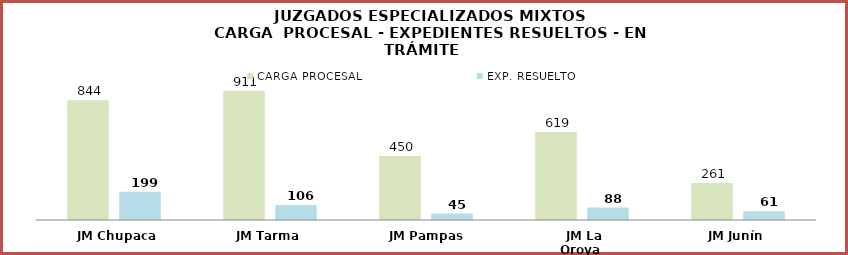
| Category | CARGA PROCESAL | EXP. RESUELTO |
|---|---|---|
| JM Chupaca | 844 | 199 |
| JM Tarma | 911 | 106 |
| JM Pampas | 450 | 45 |
| JM La Oroya | 619 | 88 |
| JM Junín | 261 | 61 |